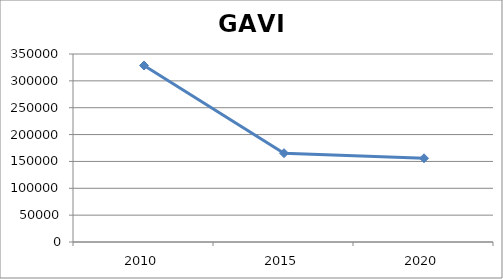
| Category | Series 0 |
|---|---|
| 2010.0 | 328615 |
| 2015.0 | 165342 |
| 2020.0 | 155865 |